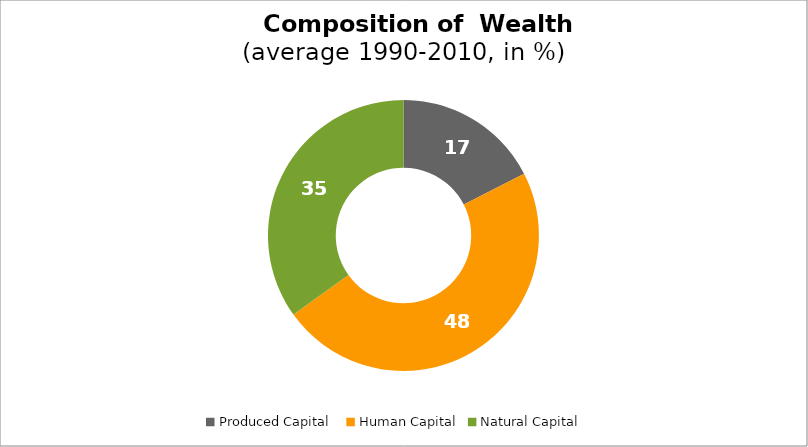
| Category | Series 0 |
|---|---|
| Produced Capital  | 17.461 |
| Human Capital | 47.632 |
| Natural Capital | 34.907 |